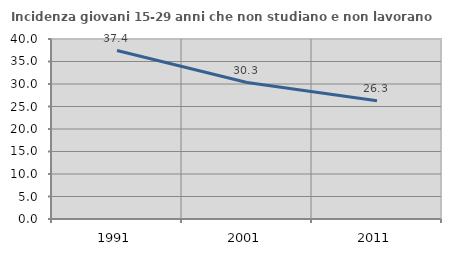
| Category | Incidenza giovani 15-29 anni che non studiano e non lavorano  |
|---|---|
| 1991.0 | 37.432 |
| 2001.0 | 30.319 |
| 2011.0 | 26.296 |